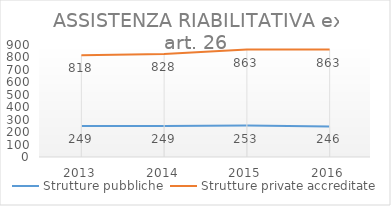
| Category | Strutture pubbliche | Strutture private accreditate |
|---|---|---|
| 2013.0 | 249 | 818 |
| 2014.0 | 249 | 828 |
| 2015.0 | 253 | 863 |
| 2016.0 | 246 | 863 |